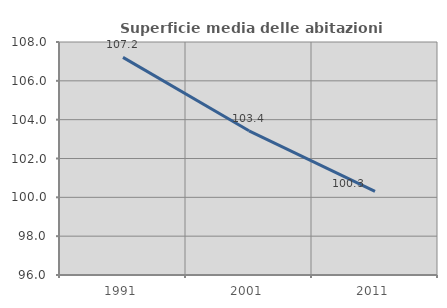
| Category | Superficie media delle abitazioni occupate |
|---|---|
| 1991.0 | 107.21 |
| 2001.0 | 103.426 |
| 2011.0 | 100.308 |